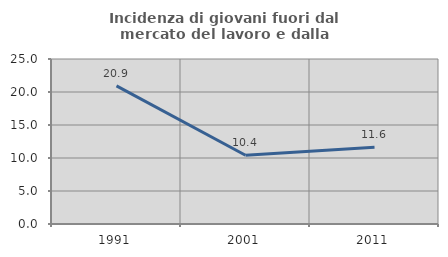
| Category | Incidenza di giovani fuori dal mercato del lavoro e dalla formazione  |
|---|---|
| 1991.0 | 20.93 |
| 2001.0 | 10.417 |
| 2011.0 | 11.628 |